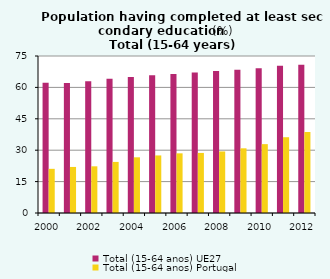
| Category | Total (15-64 anos) UE27 | Total (15-64 anos) Portugal |
|---|---|---|
| 2000.0 | 62.2 | 21.1 |
| 2001.0 | 62.1 | 22 |
| 2002.0 | 62.9 | 22.3 |
| 2003.0 | 64.1 | 24.4 |
| 2004.0 | 65 | 26.6 |
| 2005.0 | 65.8 | 27.5 |
| 2006.0 | 66.4 | 28.5 |
| 2007.0 | 67.1 | 28.7 |
| 2008.0 | 67.8 | 29.4 |
| 2009.0 | 68.4 | 30.9 |
| 2010.0 | 69.2 | 32.9 |
| 2011.0 | 70.3 | 36.2 |
| 2012.0 | 70.8 | 38.7 |